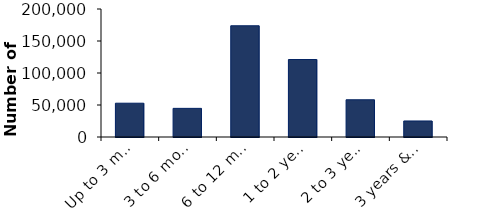
| Category | Series 1 |
|---|---|
| Up to 3 months | 52804 |
| 3 to 6 months | 44739 |
| 6 to 12 months | 173782 |
| 1 to 2 years | 121025 |
| 2 to 3 years | 58156 |
| 3 years & over | 25037 |